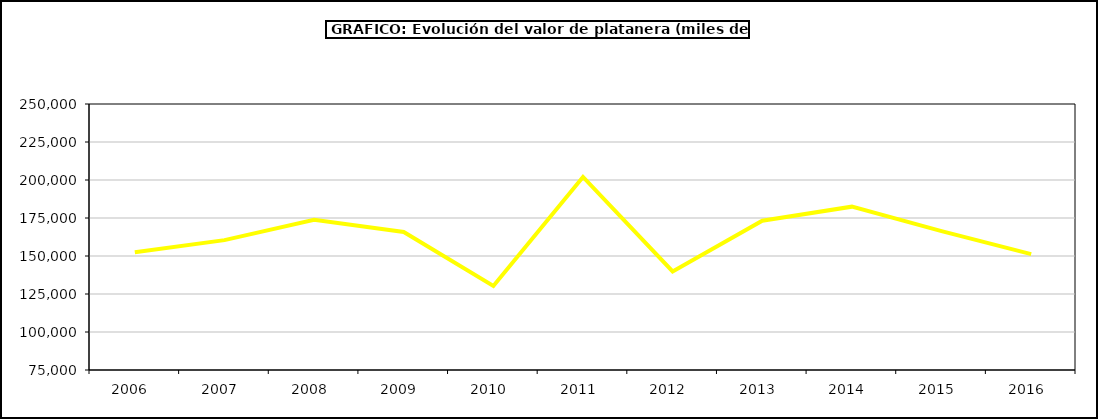
| Category | valor platanera |
|---|---|
| 2006.0 | 152411 |
| 2007.0 | 160436.416 |
| 2008.0 | 173883.195 |
| 2009.0 | 165826.349 |
| 2010.0 | 130319.145 |
| 2011.0 | 202014.747 |
| 2012.0 | 139816.382 |
| 2013.0 | 173165.464 |
| 2014.0 | 182466.749 |
| 2015.0 | 166392 |
| 2016.0 | 151266 |